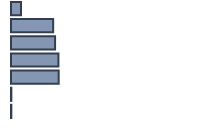
| Category | Percentatge |
|---|---|
| 0 | 5.217 |
| 1 | 21.957 |
| 2 | 22.957 |
| 3 | 24.696 |
| 4 | 24.826 |
| 5 | 0.174 |
| 6 | 0.174 |